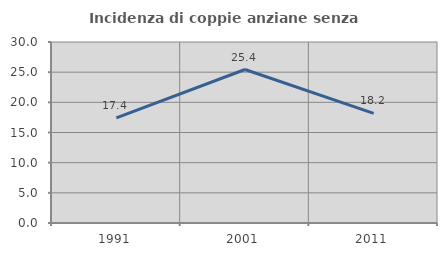
| Category | Incidenza di coppie anziane senza figli  |
|---|---|
| 1991.0 | 17.424 |
| 2001.0 | 25.439 |
| 2011.0 | 18.182 |